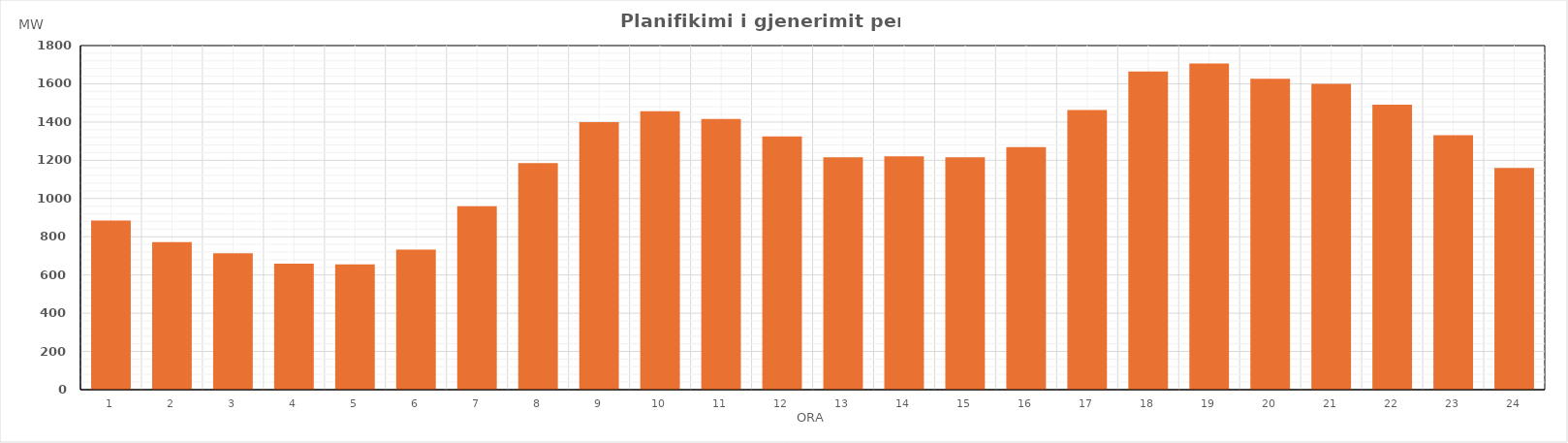
| Category | Max (MW) |
|---|---|
| 0 | 885.35 |
| 1 | 771.67 |
| 2 | 713.24 |
| 3 | 659.37 |
| 4 | 655.04 |
| 5 | 732.07 |
| 6 | 959.6 |
| 7 | 1184.65 |
| 8 | 1400.05 |
| 9 | 1456.5 |
| 10 | 1415.8 |
| 11 | 1324.96 |
| 12 | 1215.6 |
| 13 | 1220.21 |
| 14 | 1215.93 |
| 15 | 1268.89 |
| 16 | 1463.25 |
| 17 | 1663.94 |
| 18 | 1706.75 |
| 19 | 1625.95 |
| 20 | 1600.07 |
| 21 | 1491 |
| 22 | 1330.54 |
| 23 | 1159.82 |